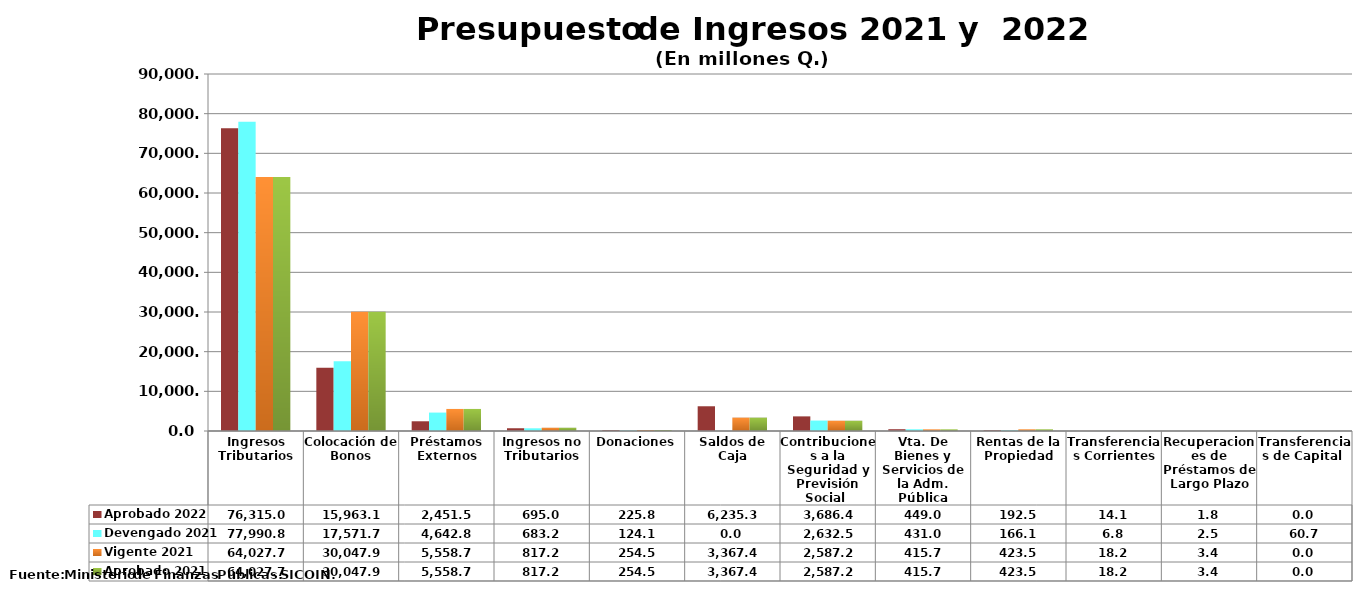
| Category | Aprobado 2022 | Devengado 2021 | Vigente 2021 | Aprobado 2021 |
|---|---|---|---|---|
| Ingresos Tributarios | 76315 | 77990.8 | 64027.7 | 64027.7 |
| Colocación de Bonos | 15963.1 | 17571.7 | 30047.9 | 30047.9 |
| Préstamos Externos | 2451.5 | 4642.8 | 5558.7 | 5558.7 |
| Ingresos no Tributarios | 695 | 683.2 | 817.2 | 817.2 |
| Donaciones | 225.8 | 124.1 | 254.5 | 254.5 |
| Saldos de Caja | 6235.3 | 0 | 3367.4 | 3367.4 |
| Contribuciones a la Seguridad y Previsión Social  | 3686.4 | 2632.5 | 2587.2 | 2587.2 |
| Vta. De Bienes y Servicios de la Adm. Pública | 449 | 431 | 415.7 | 415.7 |
| Rentas de la Propiedad | 192.5 | 166.1 | 423.5 | 423.5 |
| Transferencias Corrientes | 14.1 | 6.78 | 18.2 | 18.2 |
| Recuperaciones de Préstamos de Largo Plazo | 1.8 | 2.5 | 3.4 | 3.4 |
| Transferencias de Capital  | 0 | 60.7 | 0 | 0 |